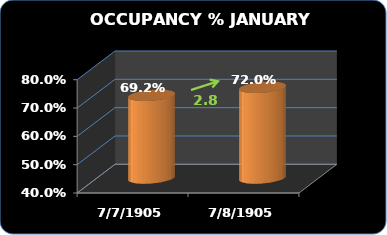
| Category | Occupancy % |
|---|---|
| 2016.0 | 0.72 |
| 2015.0 | 0.692 |